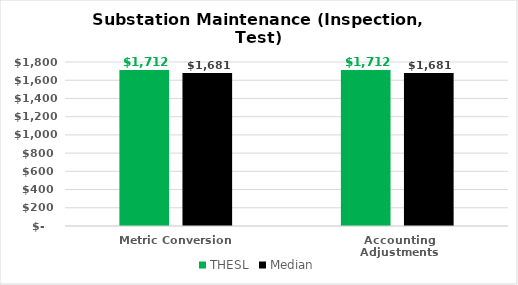
| Category | THESL | Median |
|---|---|---|
| Metric Conversion | 1712.471 | 1680.57 |
| Accounting Adjustments | 1712.471 | 1680.57 |